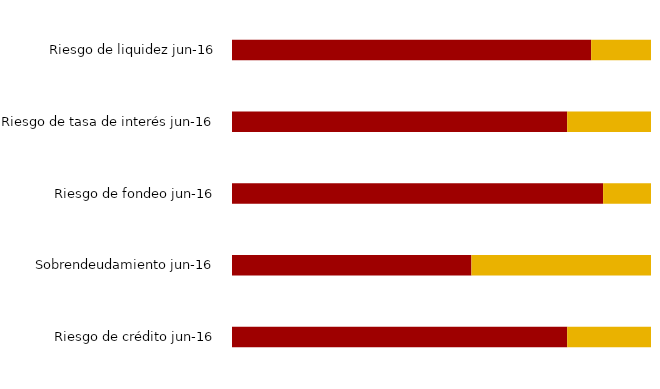
| Category | Controlado | Afecta las operaciones de la entidad |
|---|---|---|
| Riesgo de crédito jun-16 | 0.8 | 0.2 |
| Sobrendeudamiento jun-16 | 0.571 | 0.429 |
| Riesgo de fondeo jun-16 | 0.886 | 0.114 |
| Riesgo de tasa de interés jun-16 | 0.8 | 0.2 |
| Riesgo de liquidez jun-16 | 0.857 | 0.143 |